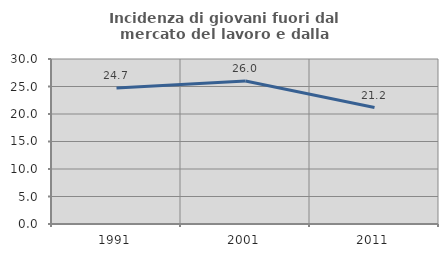
| Category | Incidenza di giovani fuori dal mercato del lavoro e dalla formazione  |
|---|---|
| 1991.0 | 24.719 |
| 2001.0 | 26.003 |
| 2011.0 | 21.177 |